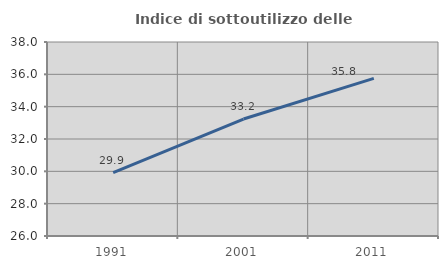
| Category | Indice di sottoutilizzo delle abitazioni  |
|---|---|
| 1991.0 | 29.914 |
| 2001.0 | 33.234 |
| 2011.0 | 35.752 |